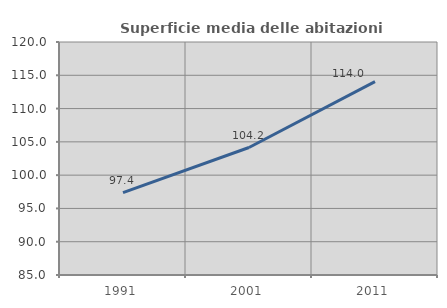
| Category | Superficie media delle abitazioni occupate |
|---|---|
| 1991.0 | 97.373 |
| 2001.0 | 104.152 |
| 2011.0 | 114.038 |